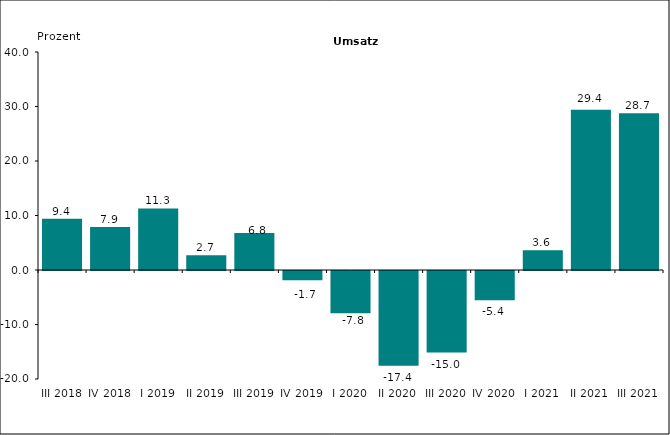
| Category | 9,4 |
|---|---|
| III 2018 | 9.4 |
| IV 2018 | 7.9 |
| I 2019 | 11.3 |
| II 2019 | 2.702 |
| III 2019 | 6.777 |
| IV 2019 | -1.702 |
| I 2020 | -7.775 |
| II 2020 | -17.405 |
| III 2020 | -14.955 |
| IV 2020 | -5.368 |
| I 2021 | 3.627 |
| II 2021 | 29.396 |
| III 2021 | 28.748 |